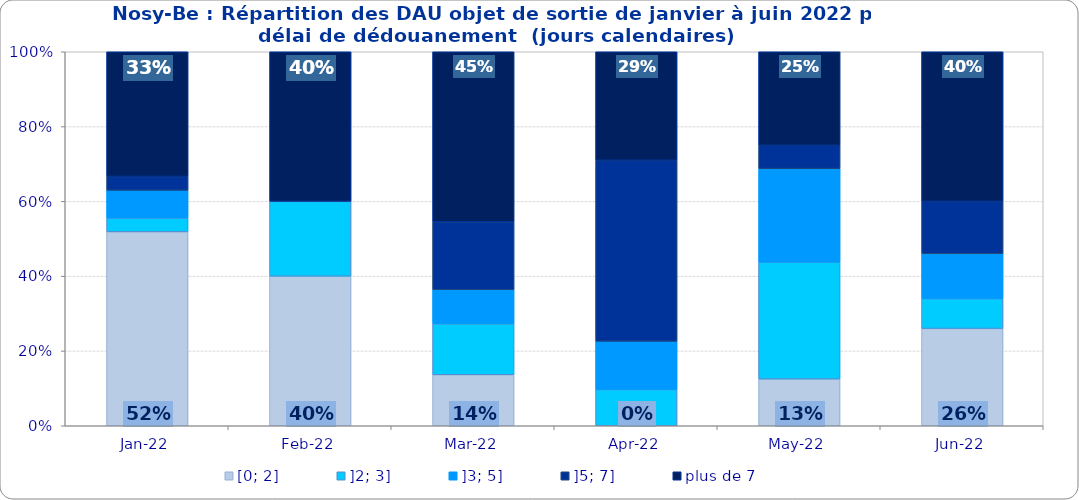
| Category | [0; 2] | ]2; 3] | ]3; 5] | ]5; 7] | plus de 7 |
|---|---|---|---|---|---|
| 2022-01-01 | 0.519 | 0.037 | 0.074 | 0.037 | 0.333 |
| 2022-02-01 | 0.4 | 0.2 | 0 | 0 | 0.4 |
| 2022-03-01 | 0.136 | 0.136 | 0.091 | 0.182 | 0.455 |
| 2022-04-01 | 0 | 0.097 | 0.129 | 0.484 | 0.29 |
| 2022-05-01 | 0.125 | 0.312 | 0.25 | 0.062 | 0.25 |
| 2022-06-01 | 0.26 | 0.08 | 0.12 | 0.14 | 0.4 |